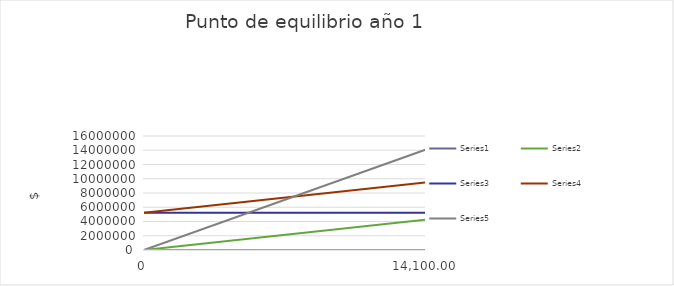
| Category | Series 0 | Series 1 | Series 2 | Series 3 | Series 4 |
|---|---|---|---|---|---|
| 0.0 | 0 | 0 | 5220104.425 | 5220104.425 | 0 |
| 14100.0 | 14100 | 4270489.827 | 5220104.425 | 9490594.252 | 14100000 |